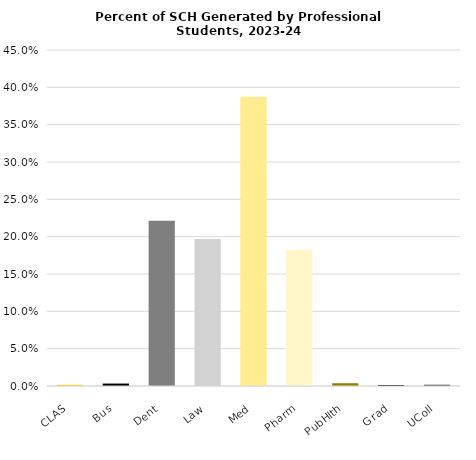
| Category | Series 0 |
|---|---|
| CLAS | 0.002 |
| Bus | 0.003 |
| Dent | 0.221 |
| Law | 0.197 |
| Med | 0.387 |
| Pharm | 0.182 |
| PubHlth | 0.004 |
| Grad | 0.001 |
| UColl | 0.002 |